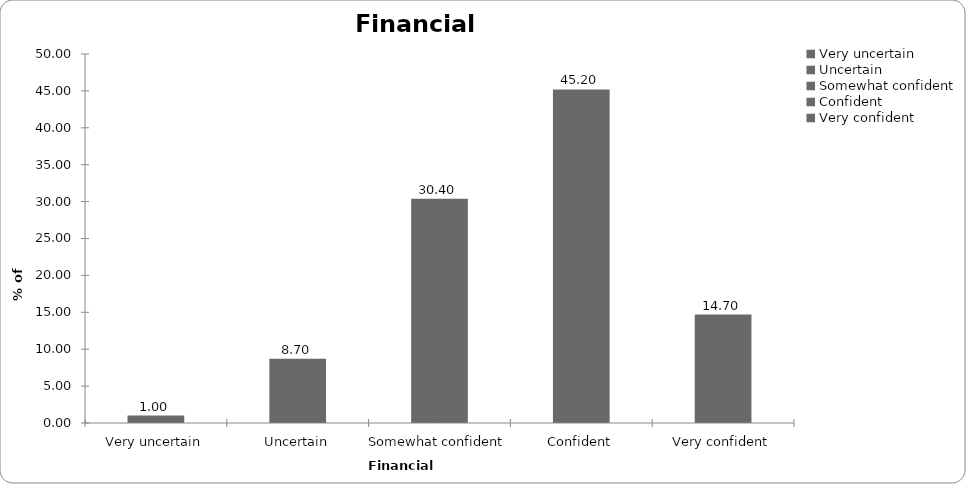
| Category | Financial confidence |
|---|---|
| Very uncertain | 1 |
| Uncertain | 8.7 |
| Somewhat confident | 30.4 |
| Confident | 45.2 |
| Very confident | 14.7 |